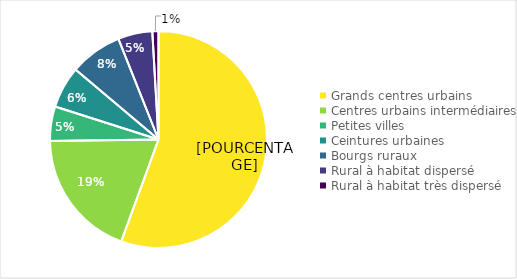
| Category | Series 0 |
|---|---|
| Grands centres urbains | 140000 |
| Centres urbains intermédiaires | 48400 |
| Petites villes | 12900 |
| Ceintures urbaines | 15700 |
| Bourgs ruraux | 19700 |
| Rural à habitat dispersé | 12900 |
| Rural à habitat très dispersé | 2300 |